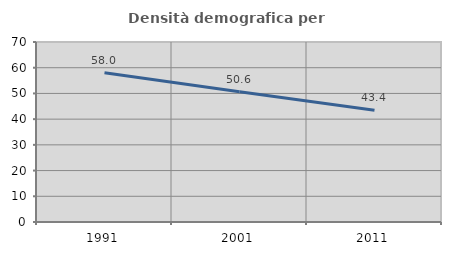
| Category | Densità demografica |
|---|---|
| 1991.0 | 58.048 |
| 2001.0 | 50.625 |
| 2011.0 | 43.445 |